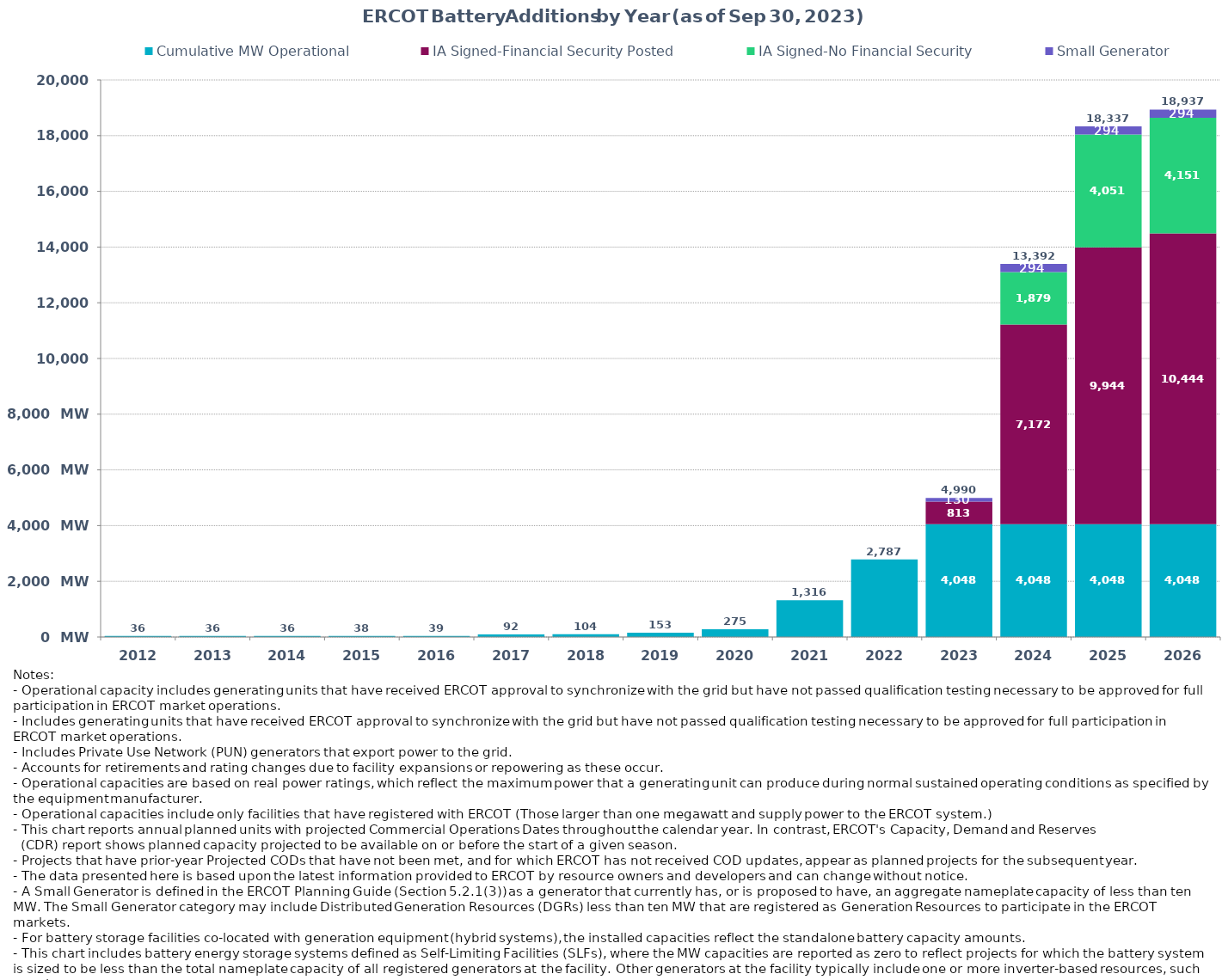
| Category | Cumulative MW Operational | IA Signed-Financial Security Posted  | IA Signed-No Financial Security  | Small Generator | Cumulative Installed and Planned |
|---|---|---|---|---|---|
| 2012.0 | 36 | 0 | 0 | 0 | 36 |
| 2013.0 | 36 | 0 | 0 | 0 | 36 |
| 2014.0 | 36 | 0 | 0 | 0 | 36 |
| 2015.0 | 38 | 0 | 0 | 0 | 38 |
| 2016.0 | 39 | 0 | 0 | 0 | 39 |
| 2017.0 | 92.3 | 0 | 0 | 0 | 92.3 |
| 2018.0 | 103.7 | 0 | 0 | 0 | 103.7 |
| 2019.0 | 153.3 | 0 | 0 | 0 | 153.3 |
| 2020.0 | 275.4 | 0 | 0 | 0 | 275.4 |
| 2021.0 | 1316.43 | 0 | 0 | 0 | 1316.43 |
| 2022.0 | 2786.86 | 0 | 0 | 0 | 2786.86 |
| 2023.0 | 4047.51 | 813.1 | 0 | 129.6 | 4990.21 |
| 2024.0 | 4047.51 | 7172.49 | 1878.53 | 293.55 | 13392.08 |
| 2025.0 | 4047.51 | 9944.2 | 4051.47 | 293.55 | 18336.73 |
| 2026.0 | 4047.51 | 10444.28 | 4151.47 | 293.55 | 18936.81 |